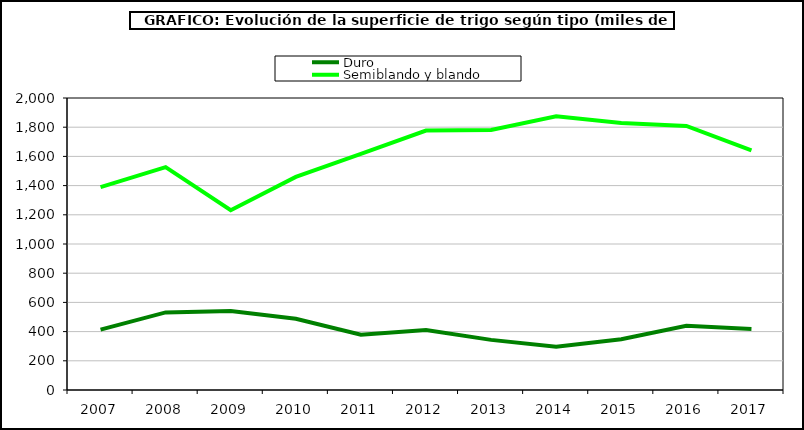
| Category | Duro | Semiblando y blando |
|---|---|---|
| 2007 | 413.41 | 1389.903 |
| 2008 | 531.661 | 1526.209 |
| 2009 | 541.581 | 1231.171 |
| 2010 | 488.306 | 1459.767 |
| 2011 | 378.054 | 1616.599 |
| 2012 | 411.053 | 1777.118 |
| 2013 | 343.389 | 1781.58 |
| 2014 | 297.13 | 1874.542 |
| 2015 | 347.93 | 1828.423 |
| 2016 | 440.16 | 1808.688 |
| 2017 | 417.589 | 1641.635 |